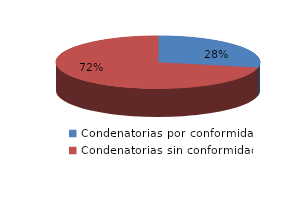
| Category | Series 0 |
|---|---|
| 0 | 13 |
| 1 | 33 |